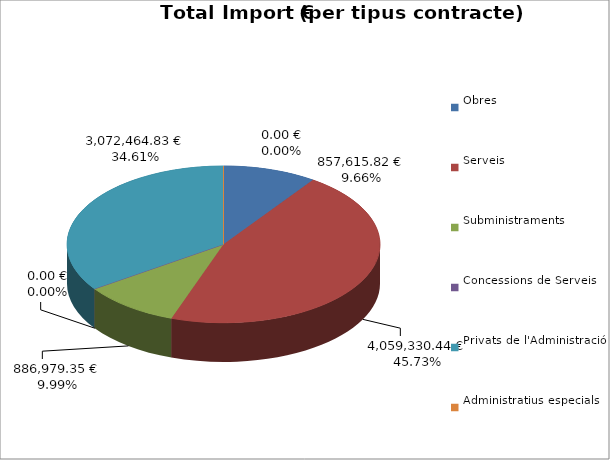
| Category | Total preu
(amb IVA) |
|---|---|
| Obres | 857615.82 |
| Serveis | 4059330.44 |
| Subministraments | 886979.35 |
| Concessions de Serveis | 0 |
| Privats de l'Administració | 3072464.83 |
| Administratius especials | 0 |